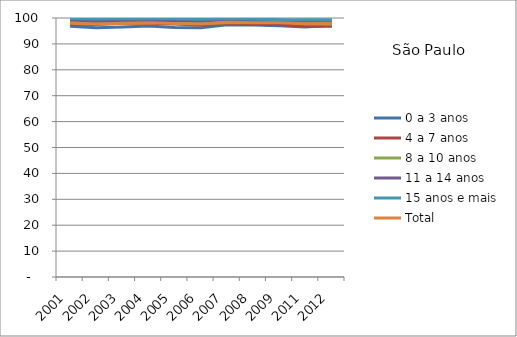
| Category | 0 a 3 anos | 4 a 7 anos | 8 a 10 anos | 11 a 14 anos | 15 anos e mais | Total |
|---|---|---|---|---|---|---|
| 2001.0 | 96.81 | 97.58 | 98.33 | 99.3 | 99.79 | 97.95 |
| 2002.0 | 96.26 | 97.53 | 98.24 | 98.79 | 99.62 | 97.67 |
| 2003.0 | 96.55 | 98.02 | 98.05 | 98.94 | 99.76 | 97.93 |
| 2004.0 | 96.95 | 98 | 98.56 | 99.05 | 99.67 | 98.15 |
| 2005.0 | 96.32 | 97.65 | 98.45 | 99.06 | 99.7 | 97.92 |
| 2006.0 | 96.26 | 97.21 | 97.93 | 98.85 | 99.52 | 97.71 |
| 2007.0 | 97.37 | 97.92 | 98.12 | 99.34 | 99.79 | 98.38 |
| 2008.0 | 97.32 | 97.49 | 98.28 | 98.82 | 99.65 | 98.14 |
| 2009.0 | 97.01 | 97.53 | 98.62 | 99.09 | 99.34 | 98.18 |
| 2011.0 | 96.5 | 96.73 | 97.82 | 98.85 | 99.29 | 97.78 |
| 2012.0 | 97.34 | 96.81 | 97.59 | 98.72 | 99.33 | 97.95 |